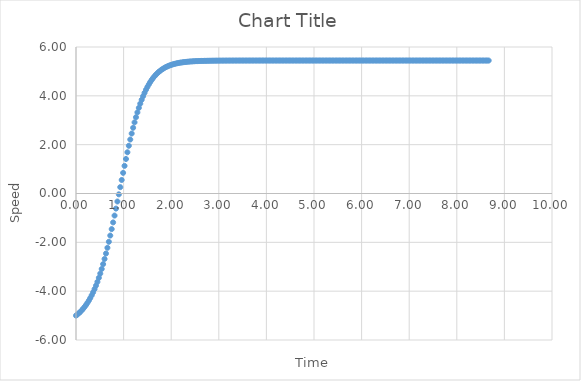
| Category | Series 0 |
|---|---|
| 0.0 | -5 |
| 0.03 | -4.954 |
| 0.06 | -4.903 |
| 0.09 | -4.847 |
| 0.12 | -4.786 |
| 0.15 | -4.72 |
| 0.18 | -4.646 |
| 0.21 | -4.566 |
| 0.24 | -4.479 |
| 0.27 | -4.384 |
| 0.30000000000000004 | -4.28 |
| 0.33000000000000007 | -4.168 |
| 0.3600000000000001 | -4.046 |
| 0.3900000000000001 | -3.914 |
| 0.42000000000000015 | -3.772 |
| 0.4500000000000002 | -3.619 |
| 0.4800000000000002 | -3.455 |
| 0.5100000000000002 | -3.279 |
| 0.5400000000000003 | -3.091 |
| 0.5700000000000003 | -2.892 |
| 0.6000000000000003 | -2.68 |
| 0.6300000000000003 | -2.457 |
| 0.6600000000000004 | -2.223 |
| 0.6900000000000004 | -1.978 |
| 0.7200000000000004 | -1.722 |
| 0.7500000000000004 | -1.457 |
| 0.7800000000000005 | -1.184 |
| 0.8100000000000005 | -0.904 |
| 0.8400000000000005 | -0.618 |
| 0.8700000000000006 | -0.327 |
| 0.9000000000000006 | -0.034 |
| 0.9300000000000006 | 0.26 |
| 0.9600000000000006 | 0.554 |
| 0.9900000000000007 | 0.845 |
| 1.0200000000000007 | 1.132 |
| 1.0500000000000007 | 1.414 |
| 1.0800000000000007 | 1.688 |
| 1.1100000000000008 | 1.954 |
| 1.1400000000000008 | 2.211 |
| 1.1700000000000008 | 2.457 |
| 1.2000000000000008 | 2.691 |
| 1.2300000000000009 | 2.913 |
| 1.260000000000001 | 3.124 |
| 1.290000000000001 | 3.321 |
| 1.320000000000001 | 3.506 |
| 1.350000000000001 | 3.678 |
| 1.380000000000001 | 3.838 |
| 1.410000000000001 | 3.986 |
| 1.440000000000001 | 4.123 |
| 1.470000000000001 | 4.248 |
| 1.500000000000001 | 4.363 |
| 1.5300000000000011 | 4.469 |
| 1.5600000000000012 | 4.565 |
| 1.5900000000000012 | 4.652 |
| 1.6200000000000012 | 4.732 |
| 1.6500000000000012 | 4.804 |
| 1.6800000000000013 | 4.869 |
| 1.7100000000000013 | 4.928 |
| 1.7400000000000013 | 4.981 |
| 1.7700000000000014 | 5.029 |
| 1.8000000000000014 | 5.073 |
| 1.8300000000000014 | 5.111 |
| 1.8600000000000014 | 5.146 |
| 1.8900000000000015 | 5.178 |
| 1.9200000000000015 | 5.206 |
| 1.9500000000000015 | 5.231 |
| 1.9800000000000015 | 5.254 |
| 2.0100000000000016 | 5.274 |
| 2.0400000000000014 | 5.292 |
| 2.070000000000001 | 5.309 |
| 2.100000000000001 | 5.323 |
| 2.130000000000001 | 5.336 |
| 2.1600000000000006 | 5.348 |
| 2.1900000000000004 | 5.358 |
| 2.22 | 5.368 |
| 2.25 | 5.376 |
| 2.28 | 5.383 |
| 2.3099999999999996 | 5.39 |
| 2.3399999999999994 | 5.396 |
| 2.369999999999999 | 5.401 |
| 2.399999999999999 | 5.406 |
| 2.429999999999999 | 5.41 |
| 2.4599999999999986 | 5.414 |
| 2.4899999999999984 | 5.417 |
| 2.5199999999999982 | 5.42 |
| 2.549999999999998 | 5.423 |
| 2.579999999999998 | 5.425 |
| 2.6099999999999977 | 5.427 |
| 2.6399999999999975 | 5.429 |
| 2.6699999999999973 | 5.431 |
| 2.699999999999997 | 5.433 |
| 2.729999999999997 | 5.434 |
| 2.7599999999999967 | 5.435 |
| 2.7899999999999965 | 5.436 |
| 2.8199999999999963 | 5.437 |
| 2.849999999999996 | 5.438 |
| 2.879999999999996 | 5.439 |
| 2.9099999999999957 | 5.439 |
| 2.9399999999999955 | 5.44 |
| 2.9699999999999953 | 5.441 |
| 2.999999999999995 | 5.441 |
| 3.029999999999995 | 5.442 |
| 3.0599999999999947 | 5.442 |
| 3.0899999999999945 | 5.442 |
| 3.1199999999999943 | 5.443 |
| 3.149999999999994 | 5.443 |
| 3.179999999999994 | 5.443 |
| 3.2099999999999937 | 5.443 |
| 3.2399999999999936 | 5.443 |
| 3.2699999999999934 | 5.444 |
| 3.299999999999993 | 5.444 |
| 3.329999999999993 | 5.444 |
| 3.3599999999999928 | 5.444 |
| 3.3899999999999926 | 5.444 |
| 3.4199999999999924 | 5.444 |
| 3.449999999999992 | 5.444 |
| 3.479999999999992 | 5.444 |
| 3.509999999999992 | 5.445 |
| 3.5399999999999916 | 5.445 |
| 3.5699999999999914 | 5.445 |
| 3.599999999999991 | 5.445 |
| 3.629999999999991 | 5.445 |
| 3.659999999999991 | 5.445 |
| 3.6899999999999906 | 5.445 |
| 3.7199999999999904 | 5.445 |
| 3.7499999999999902 | 5.445 |
| 3.77999999999999 | 5.445 |
| 3.80999999999999 | 5.445 |
| 3.8399999999999896 | 5.445 |
| 3.8699999999999894 | 5.445 |
| 3.8999999999999893 | 5.445 |
| 3.929999999999989 | 5.445 |
| 3.959999999999989 | 5.445 |
| 3.9899999999999887 | 5.445 |
| 4.019999999999989 | 5.445 |
| 4.049999999999989 | 5.445 |
| 4.079999999999989 | 5.445 |
| 4.10999999999999 | 5.445 |
| 4.13999999999999 | 5.445 |
| 4.16999999999999 | 5.445 |
| 4.19999999999999 | 5.445 |
| 4.229999999999991 | 5.445 |
| 4.259999999999991 | 5.445 |
| 4.289999999999991 | 5.445 |
| 4.319999999999991 | 5.445 |
| 4.349999999999992 | 5.445 |
| 4.379999999999992 | 5.445 |
| 4.409999999999992 | 5.445 |
| 4.439999999999992 | 5.445 |
| 4.469999999999993 | 5.445 |
| 4.499999999999993 | 5.445 |
| 4.529999999999993 | 5.445 |
| 4.559999999999993 | 5.445 |
| 4.589999999999994 | 5.445 |
| 4.619999999999994 | 5.445 |
| 4.649999999999994 | 5.445 |
| 4.679999999999994 | 5.445 |
| 4.709999999999995 | 5.445 |
| 4.739999999999995 | 5.445 |
| 4.769999999999995 | 5.445 |
| 4.799999999999995 | 5.445 |
| 4.829999999999996 | 5.445 |
| 4.859999999999996 | 5.445 |
| 4.889999999999996 | 5.445 |
| 4.919999999999996 | 5.445 |
| 4.949999999999997 | 5.445 |
| 4.979999999999997 | 5.445 |
| 5.009999999999997 | 5.445 |
| 5.039999999999997 | 5.445 |
| 5.069999999999998 | 5.445 |
| 5.099999999999998 | 5.445 |
| 5.129999999999998 | 5.445 |
| 5.159999999999998 | 5.445 |
| 5.189999999999999 | 5.445 |
| 5.219999999999999 | 5.445 |
| 5.249999999999999 | 5.445 |
| 5.279999999999999 | 5.445 |
| 5.31 | 5.445 |
| 5.34 | 5.445 |
| 5.37 | 5.445 |
| 5.4 | 5.445 |
| 5.430000000000001 | 5.445 |
| 5.460000000000001 | 5.445 |
| 5.490000000000001 | 5.445 |
| 5.520000000000001 | 5.445 |
| 5.550000000000002 | 5.445 |
| 5.580000000000002 | 5.445 |
| 5.610000000000002 | 5.445 |
| 5.640000000000002 | 5.445 |
| 5.670000000000003 | 5.445 |
| 5.700000000000003 | 5.445 |
| 5.730000000000003 | 5.445 |
| 5.760000000000003 | 5.445 |
| 5.790000000000004 | 5.445 |
| 5.820000000000004 | 5.445 |
| 5.850000000000004 | 5.445 |
| 5.880000000000004 | 5.445 |
| 5.910000000000005 | 5.445 |
| 5.940000000000005 | 5.445 |
| 5.970000000000005 | 5.445 |
| 6.000000000000005 | 5.445 |
| 6.030000000000006 | 5.445 |
| 6.060000000000006 | 5.445 |
| 6.090000000000006 | 5.445 |
| 6.120000000000006 | 5.445 |
| 6.150000000000007 | 5.445 |
| 6.180000000000007 | 5.445 |
| 6.210000000000007 | 5.445 |
| 6.240000000000007 | 5.445 |
| 6.270000000000008 | 5.445 |
| 6.300000000000008 | 5.445 |
| 6.330000000000008 | 5.445 |
| 6.360000000000008 | 5.445 |
| 6.390000000000009 | 5.445 |
| 6.420000000000009 | 5.445 |
| 6.450000000000009 | 5.445 |
| 6.480000000000009 | 5.445 |
| 6.51000000000001 | 5.445 |
| 6.54000000000001 | 5.445 |
| 6.57000000000001 | 5.445 |
| 6.60000000000001 | 5.445 |
| 6.6300000000000106 | 5.445 |
| 6.660000000000011 | 5.445 |
| 6.690000000000011 | 5.445 |
| 6.720000000000011 | 5.445 |
| 6.7500000000000115 | 5.445 |
| 6.780000000000012 | 5.445 |
| 6.810000000000012 | 5.445 |
| 6.840000000000012 | 5.445 |
| 6.8700000000000125 | 5.445 |
| 6.900000000000013 | 5.445 |
| 6.930000000000013 | 5.445 |
| 6.960000000000013 | 5.445 |
| 6.9900000000000135 | 5.445 |
| 7.020000000000014 | 5.445 |
| 7.050000000000014 | 5.445 |
| 7.080000000000014 | 5.445 |
| 7.1100000000000145 | 5.445 |
| 7.140000000000015 | 5.445 |
| 7.170000000000015 | 5.445 |
| 7.200000000000015 | 5.445 |
| 7.2300000000000155 | 5.445 |
| 7.260000000000016 | 5.445 |
| 7.290000000000016 | 5.445 |
| 7.320000000000016 | 5.445 |
| 7.3500000000000165 | 5.445 |
| 7.380000000000017 | 5.445 |
| 7.410000000000017 | 5.445 |
| 7.440000000000017 | 5.445 |
| 7.4700000000000175 | 5.445 |
| 7.500000000000018 | 5.445 |
| 7.530000000000018 | 5.445 |
| 7.560000000000018 | 5.445 |
| 7.5900000000000185 | 5.445 |
| 7.620000000000019 | 5.445 |
| 7.650000000000019 | 5.445 |
| 7.680000000000019 | 5.445 |
| 7.7100000000000195 | 5.445 |
| 7.74000000000002 | 5.445 |
| 7.77000000000002 | 5.445 |
| 7.80000000000002 | 5.445 |
| 7.8300000000000205 | 5.445 |
| 7.860000000000021 | 5.445 |
| 7.890000000000021 | 5.445 |
| 7.920000000000021 | 5.445 |
| 7.9500000000000215 | 5.445 |
| 7.980000000000022 | 5.445 |
| 8.010000000000021 | 5.445 |
| 8.04000000000002 | 5.445 |
| 8.07000000000002 | 5.445 |
| 8.10000000000002 | 5.445 |
| 8.130000000000019 | 5.445 |
| 8.160000000000018 | 5.445 |
| 8.190000000000017 | 5.445 |
| 8.220000000000017 | 5.445 |
| 8.250000000000016 | 5.445 |
| 8.280000000000015 | 5.445 |
| 8.310000000000015 | 5.445 |
| 8.340000000000014 | 5.445 |
| 8.370000000000013 | 5.445 |
| 8.400000000000013 | 5.445 |
| 8.430000000000012 | 5.445 |
| 8.460000000000012 | 5.445 |
| 8.49000000000001 | 5.445 |
| 8.52000000000001 | 5.445 |
| 8.55000000000001 | 5.445 |
| 8.580000000000009 | 5.445 |
| 8.610000000000008 | 5.445 |
| 8.640000000000008 | 5.445 |
| 8.670000000000007 | 5.445 |